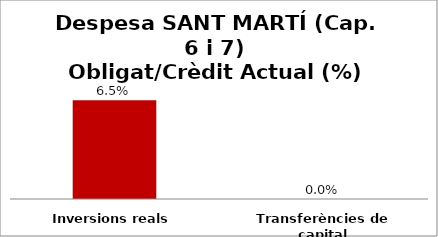
| Category | Series 0 |
|---|---|
| Inversions reals | 0.065 |
| Transferències de capital | 0 |